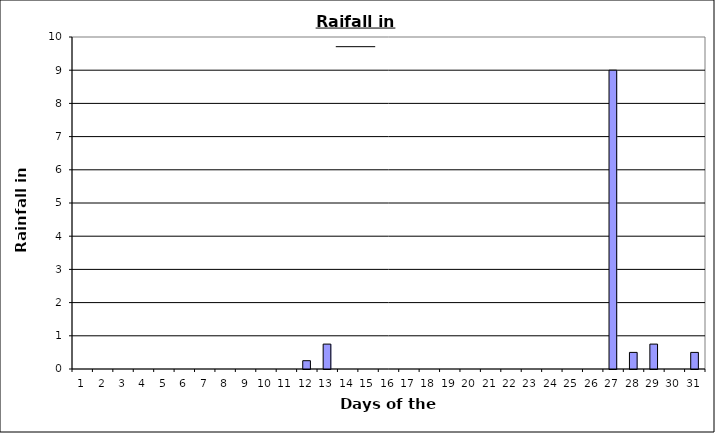
| Category | Series 0 |
|---|---|
| 0 | 0 |
| 1 | 0 |
| 2 | 0 |
| 3 | 0 |
| 4 | 0 |
| 5 | 0 |
| 6 | 0 |
| 7 | 0 |
| 8 | 0 |
| 9 | 0 |
| 10 | 0 |
| 11 | 0.25 |
| 12 | 0.75 |
| 13 | 0 |
| 14 | 0 |
| 15 | 0 |
| 16 | 0 |
| 17 | 0 |
| 18 | 0 |
| 19 | 0 |
| 20 | 0 |
| 21 | 0 |
| 22 | 0 |
| 23 | 0 |
| 24 | 0 |
| 25 | 0 |
| 26 | 9 |
| 27 | 0.5 |
| 28 | 0.75 |
| 29 | 0 |
| 30 | 0.5 |